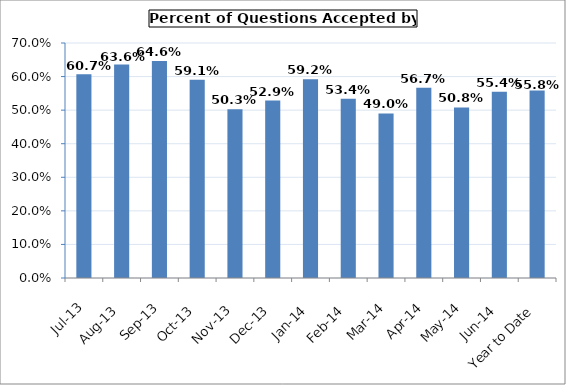
| Category | Series 0 |
|---|---|
| Jul-13 | 0.607 |
| Aug-13 | 0.636 |
| Sep-13 | 0.646 |
| Oct-13 | 0.591 |
| Nov-13 | 0.503 |
| Dec-13 | 0.529 |
| Jan-14 | 0.592 |
| Feb-14 | 0.534 |
| Mar-14 | 0.49 |
| Apr-14 | 0.567 |
| May-14 | 0.508 |
| Jun-14 | 0.554 |
| Year to Date | 0.558 |